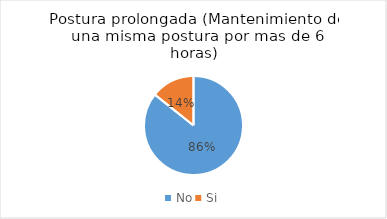
| Category | Series 0 |
|---|---|
| No | 6 |
| Si | 1 |